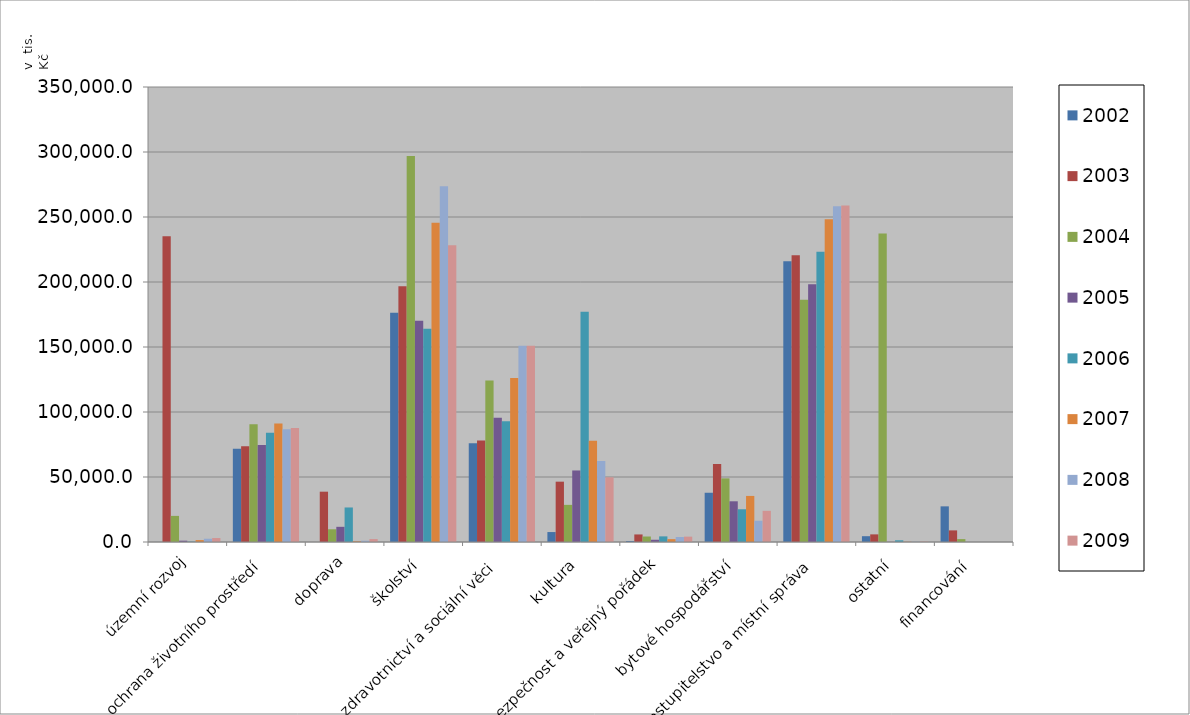
| Category | 2002 | 2003 | 2004 | 2005 | 2006 | 2007 | 2008 | 2009 |
|---|---|---|---|---|---|---|---|---|
| územní rozvoj | 34.4 | 235190.9 | 20078.8 | 1017.3 | 280.5 | 1466.1 | 2517.7 | 3043.4 |
| ochrana životního prostředí | 71756.5 | 73731.4 | 90643.4 | 74567 | 84025 | 91066.1 | 86714.5 | 87780.4 |
| doprava | 14.9 | 38705.5 | 9782.3 | 11677.4 | 26559.4 | 512.3 | 962.7 | 2256.4 |
| školství | 176425.8 | 196734.3 | 296898.2 | 170250 | 163968.6 | 245494.7 | 273647.1 | 228258.6 |
| zdravotnictví a sociální věci | 75996 | 78017.7 | 124179.6 | 95569.2 | 92953.2 | 126211.2 | 150950.1 | 150993.4 |
| kultura | 7654.1 | 46410.9 | 28565.2 | 55020.3 | 177120.7 | 77801.1 | 62327.8 | 49764.1 |
| bezpečnost a veřejný pořádek | 732.7 | 5814.5 | 4226.2 | 1725.5 | 4329.2 | 2202.9 | 3826 | 4124.8 |
| bytové hospodářství | 37880.7 | 60012.3 | 48947 | 31316.7 | 25180.4 | 35440 | 16352.3 | 23973.7 |
| zastupitelstvo a místní správa | 216042.1 | 220619.3 | 186406.4 | 198330.8 | 223317.8 | 248250.5 | 258196.7 | 258835.6 |
| ostatní | 4466.2 | 5867.4 | 237377.2 | 77.5 | 1311.5 | 151 | 186 | 328.4 |
| financování | 27420.6 | 8936.3 | 2233.6 | 0 | 0 | 0 | 0 | 0 |